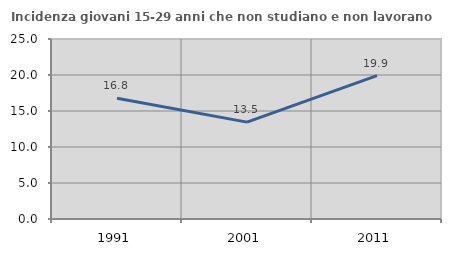
| Category | Incidenza giovani 15-29 anni che non studiano e non lavorano  |
|---|---|
| 1991.0 | 16.775 |
| 2001.0 | 13.458 |
| 2011.0 | 19.912 |